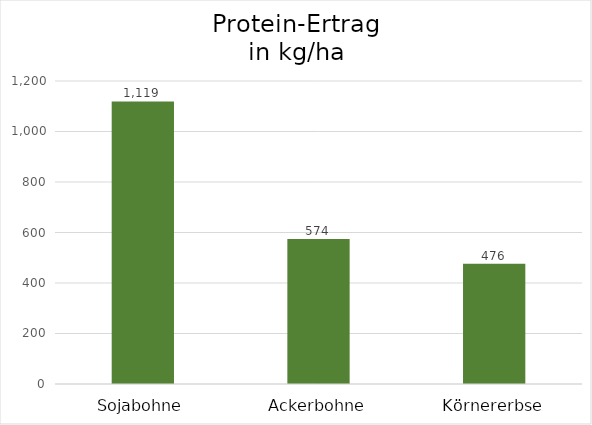
| Category | Protein-Ertrag
in kg/ha |
|---|---|
| Sojabohne | 1119 |
| Ackerbohne | 574 |
| Körnererbse | 476 |